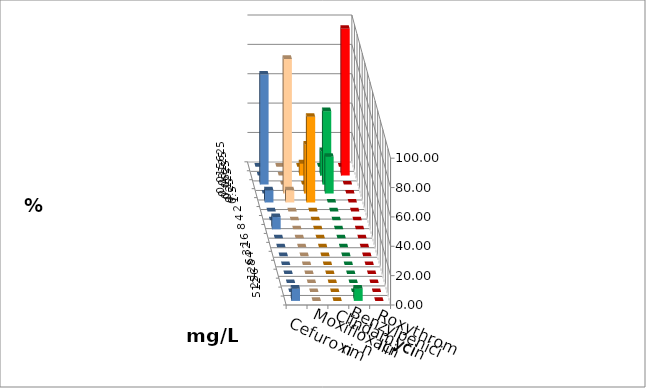
| Category | Cefuroxim | Moxifloxacin | Clindamycin | Benzylpenicillin | Roxythromycin |
|---|---|---|---|---|---|
| 0.015625 | 0 | 0 | 0 | 0 | 0 |
| 0.03125 | 0 | 8.333 | 16.667 | 100 | 0 |
| 0.0625 | 0 | 0 | 50 | 0 | 75 |
| 0.125 | 91.667 | 33.333 | 25 | 0 | 0 |
| 0.25 | 8.333 | 58.333 | 0 | 0 | 8.333 |
| 0.5 | 0 | 0 | 0 | 0 | 0 |
| 1.0 | 0 | 0 | 0 | 0 | 0 |
| 2.0 | 0 | 0 | 0 | 0 | 8.333 |
| 4.0 | 0 | 0 | 0 | 0 | 0 |
| 8.0 | 0 | 0 | 0 | 0 | 0 |
| 16.0 | 0 | 0 | 0 | 0 | 0 |
| 32.0 | 0 | 0 | 0 | 0 | 0 |
| 64.0 | 0 | 0 | 0 | 0 | 0 |
| 128.0 | 0 | 0 | 0 | 0 | 0 |
| 256.0 | 0 | 0 | 0 | 0 | 0 |
| 512.0 | 0 | 0 | 8.333 | 0 | 8.333 |